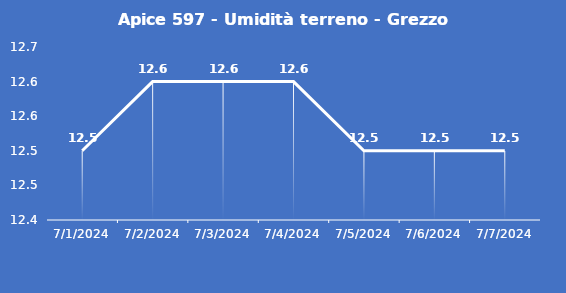
| Category | Apice 597 - Umidità terreno - Grezzo (%VWC) |
|---|---|
| 7/1/24 | 12.5 |
| 7/2/24 | 12.6 |
| 7/3/24 | 12.6 |
| 7/4/24 | 12.6 |
| 7/5/24 | 12.5 |
| 7/6/24 | 12.5 |
| 7/7/24 | 12.5 |